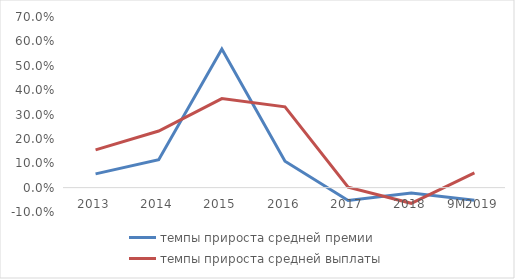
| Category | темпы прироста средней премии | темпы прироста средней выплаты |
|---|---|---|
| 2013 | 0.056 | 0.155 |
| 2014 | 0.114 | 0.232 |
| 2015 | 0.569 | 0.365 |
| 2016 | 0.108 | 0.331 |
| 2017 | -0.053 | 0.002 |
| 2018 | -0.022 | -0.064 |
| 9М2019 | -0.052 | 0.06 |